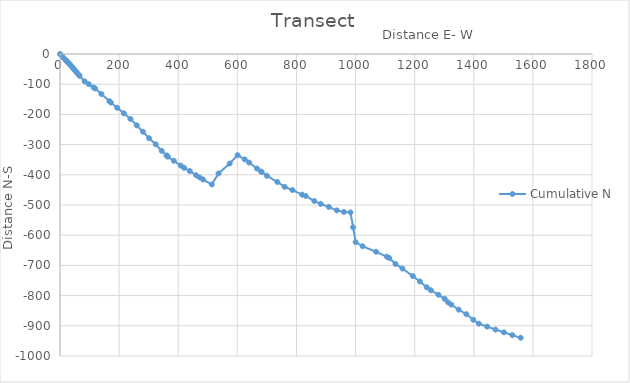
| Category | Cumulative N |
|---|---|
| 0.0 | 0 |
| 4.411080652414633 | -4.568 |
| 7.64124207504897 | -7.913 |
| 12.295453157124252 | -12.732 |
| 18.964173513530625 | -19.638 |
| 21.985937425027263 | -22.767 |
| 24.820143576499973 | -25.702 |
| 27.45984538424416 | -28.436 |
| 29.891149680850653 | -30.953 |
| 34.336963251788234 | -35.557 |
| 38.66695284312558 | -40.538 |
| 42.53770111416957 | -44.991 |
| 46.408449385213565 | -49.444 |
| 51.13207439394522 | -54.878 |
| 55.10123151933779 | -59.444 |
| 58.643950275886525 | -63.519 |
| 63.1379546244715 | -68.689 |
| 66.28703796362593 | -72.311 |
| 83.23469721117903 | -90.485 |
| 97.32833594461474 | -99.992 |
| 113.49456860943805 | -110.896 |
| 118.80900587379115 | -114.089 |
| 139.94087412002875 | -132.459 |
| 166.959477092004 | -155.946 |
| 172.0789530033382 | -160.72 |
| 193.6058961356963 | -178.152 |
| 215.98769982565705 | -196.276 |
| 238.50940645335498 | -215.174 |
| 259.5811885327141 | -236.246 |
| 280.7236812901919 | -257.389 |
| 301.4939665669159 | -278.897 |
| 323.63968236614227 | -298.837 |
| 343.9632334960047 | -320.631 |
| 360.41869178243604 | -335.976 |
| 361.29631622437904 | -336.795 |
| 364.6605432518272 | -339.932 |
| 385.05486753668123 | -353.688 |
| 408.4337270827334 | -369.457 |
| 419.83964680679117 | -376.864 |
| 439.0812803638579 | -387.53 |
| 460.4673798464662 | -401.418 |
| 472.1280411686171 | -408.705 |
| 484.0791917408423 | -415.605 |
| 513.6413378421539 | -431.991 |
| 536.4278662041818 | -395.525 |
| 574.1633452153204 | -362.722 |
| 600.8729595594689 | -335.064 |
| 625.1216708654332 | -349.064 |
| 640.1940684803507 | -359.618 |
| 666.2295861078924 | -379.237 |
| 680.4828316785208 | -389.217 |
| 682.1211357670988 | -390.364 |
| 699.9195096433477 | -403.295 |
| 735.2533461177528 | -423.695 |
| 760.0779949289374 | -439.817 |
| 786.4100163986342 | -450.456 |
| 819.3996198467682 | -465.839 |
| 831.4077057568795 | -469.974 |
| 860.5061593240366 | -486.774 |
| 882.2485412159306 | -496.454 |
| 909.4996272187219 | -506.372 |
| 936.5624699102236 | -517.86 |
| 960.6249008882753 | -522.975 |
| 982.9703356140953 | -524.537 |
| 991.6527444974419 | -573.778 |
| 1000.3351533807884 | -623.018 |
| 1023.7178392829683 | -636.518 |
| 1069.1498481567407 | -654.874 |
| 1105.8743755539733 | -671.224 |
| 1113.8209038897037 | -675.45 |
| 1135.0301612366595 | -695.228 |
| 1158.5129371391313 | -710.478 |
| 1193.736475043558 | -735.141 |
| 1217.6955403449767 | -753.196 |
| 1240.676873638546 | -772.479 |
| 1254.6024583914589 | -782.23 |
| 1280.583220504992 | -797.23 |
| 1301.5499847036276 | -810.846 |
| 1313.2172465932056 | -822.513 |
| 1323.9947350364212 | -829.783 |
| 1348.8658622130724 | -846.559 |
| 1374.8466243266057 | -861.559 |
| 1398.4869469348073 | -880.029 |
| 1416.9997831357384 | -892.991 |
| 1445.176236688598 | -902.693 |
| 1473.3526902414576 | -912.395 |
| 1501.8843857303123 | -921.666 |
| 1530.416081219167 | -930.936 |
| 1558.7227019956729 | -939.591 |